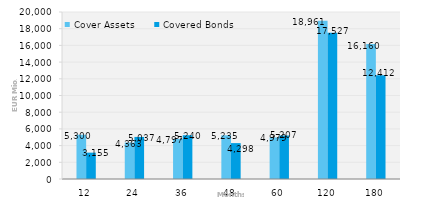
| Category | Cover Assets | Covered Bonds |
|---|---|---|
| 12.0 | 5300.323 | 3155 |
| 24.0 | 4363.136 | 5036.968 |
| 36.0 | 4796.649 | 5239.918 |
| 48.0 | 5234.75 | 4297.954 |
| 60.0 | 4978.963 | 5207.135 |
| 120.0 | 18961.396 | 17526.567 |
| 180.0 | 16160.249 | 12411.822 |